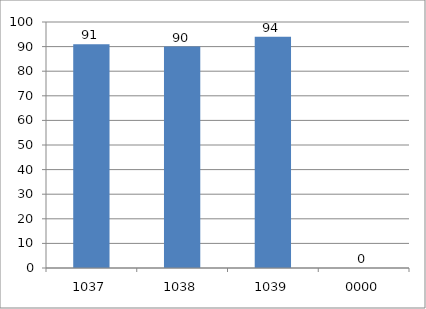
| Category | Series 0 |
|---|---|
| 1037.0 | 91 |
| 1038.0 | 90 |
| 1039.0 | 94 |
| 0.0 | 0 |